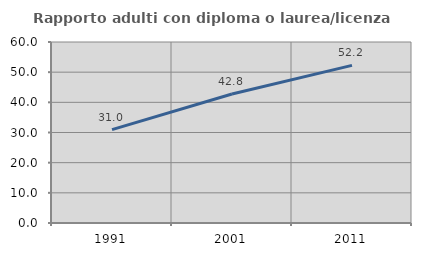
| Category | Rapporto adulti con diploma o laurea/licenza media  |
|---|---|
| 1991.0 | 30.972 |
| 2001.0 | 42.757 |
| 2011.0 | 52.24 |